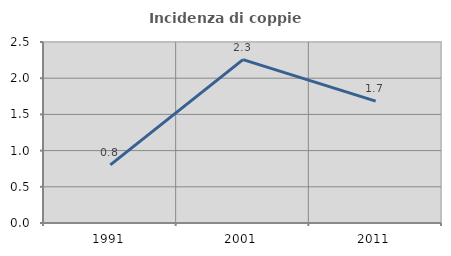
| Category | Incidenza di coppie miste |
|---|---|
| 1991.0 | 0.803 |
| 2001.0 | 2.257 |
| 2011.0 | 1.683 |